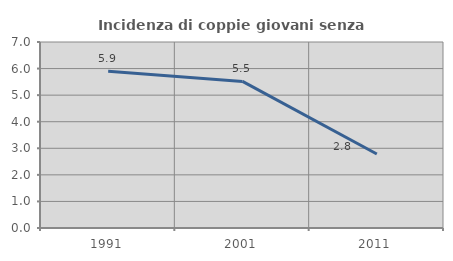
| Category | Incidenza di coppie giovani senza figli |
|---|---|
| 1991.0 | 5.901 |
| 2001.0 | 5.517 |
| 2011.0 | 2.786 |